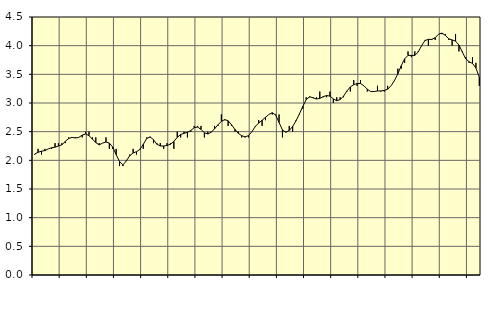
| Category | Piggar | Series 1 |
|---|---|---|
| nan | 2.1 | 2.11 |
| 87.0 | 2.2 | 2.14 |
| 87.0 | 2.1 | 2.16 |
| 87.0 | 2.2 | 2.17 |
| nan | 2.2 | 2.2 |
| 88.0 | 2.2 | 2.22 |
| 88.0 | 2.3 | 2.23 |
| 88.0 | 2.3 | 2.25 |
| nan | 2.3 | 2.27 |
| 89.0 | 2.3 | 2.33 |
| 89.0 | 2.4 | 2.38 |
| 89.0 | 2.4 | 2.4 |
| nan | 2.4 | 2.39 |
| 90.0 | 2.4 | 2.4 |
| 90.0 | 2.4 | 2.44 |
| 90.0 | 2.5 | 2.46 |
| nan | 2.5 | 2.43 |
| 91.0 | 2.4 | 2.37 |
| 91.0 | 2.4 | 2.31 |
| 91.0 | 2.3 | 2.27 |
| nan | 2.3 | 2.3 |
| 92.0 | 2.4 | 2.32 |
| 92.0 | 2.2 | 2.3 |
| 92.0 | 2.2 | 2.23 |
| nan | 2.2 | 2.1 |
| 93.0 | 1.9 | 1.98 |
| 93.0 | 1.9 | 1.92 |
| 93.0 | 2 | 1.99 |
| nan | 2.1 | 2.08 |
| 94.0 | 2.2 | 2.13 |
| 94.0 | 2.1 | 2.15 |
| 94.0 | 2.2 | 2.19 |
| nan | 2.2 | 2.28 |
| 95.0 | 2.4 | 2.38 |
| 95.0 | 2.4 | 2.41 |
| 95.0 | 2.3 | 2.36 |
| nan | 2.3 | 2.28 |
| 96.0 | 2.3 | 2.25 |
| 96.0 | 2.2 | 2.25 |
| 96.0 | 2.3 | 2.26 |
| nan | 2.3 | 2.28 |
| 97.0 | 2.2 | 2.33 |
| 97.0 | 2.5 | 2.4 |
| 97.0 | 2.4 | 2.45 |
| nan | 2.5 | 2.47 |
| 98.0 | 2.4 | 2.49 |
| 98.0 | 2.5 | 2.52 |
| 98.0 | 2.6 | 2.57 |
| nan | 2.6 | 2.58 |
| 99.0 | 2.6 | 2.54 |
| 99.0 | 2.4 | 2.48 |
| 99.0 | 2.5 | 2.46 |
| nan | 2.5 | 2.49 |
| 0.0 | 2.6 | 2.55 |
| 0.0 | 2.6 | 2.62 |
| 0.0 | 2.8 | 2.68 |
| nan | 2.7 | 2.71 |
| 1.0 | 2.6 | 2.69 |
| 1.0 | 2.6 | 2.62 |
| 1.0 | 2.5 | 2.54 |
| nan | 2.5 | 2.47 |
| 2.0 | 2.4 | 2.43 |
| 2.0 | 2.4 | 2.41 |
| 2.0 | 2.4 | 2.43 |
| nan | 2.5 | 2.5 |
| 3.0 | 2.6 | 2.59 |
| 3.0 | 2.7 | 2.65 |
| 3.0 | 2.6 | 2.7 |
| nan | 2.7 | 2.75 |
| 4.0 | 2.8 | 2.8 |
| 4.0 | 2.8 | 2.83 |
| 4.0 | 2.8 | 2.79 |
| nan | 2.8 | 2.66 |
| 5.0 | 2.4 | 2.53 |
| 5.0 | 2.5 | 2.49 |
| 5.0 | 2.6 | 2.52 |
| nan | 2.5 | 2.59 |
| 6.0 | 2.7 | 2.69 |
| 6.0 | 2.8 | 2.81 |
| 6.0 | 2.9 | 2.94 |
| nan | 3.1 | 3.06 |
| 7.0 | 3.1 | 3.11 |
| 7.0 | 3.1 | 3.09 |
| 7.0 | 3.1 | 3.07 |
| nan | 3.2 | 3.08 |
| 8.0 | 3.1 | 3.11 |
| 8.0 | 3.1 | 3.13 |
| 8.0 | 3.2 | 3.12 |
| nan | 3 | 3.07 |
| 9.0 | 3.1 | 3.04 |
| 9.0 | 3.1 | 3.06 |
| 9.0 | 3.1 | 3.12 |
| nan | 3.2 | 3.21 |
| 10.0 | 3.2 | 3.28 |
| 10.0 | 3.4 | 3.32 |
| 10.0 | 3.3 | 3.34 |
| nan | 3.4 | 3.34 |
| 11.0 | 3.3 | 3.3 |
| 11.0 | 3.2 | 3.24 |
| 11.0 | 3.2 | 3.2 |
| nan | 3.2 | 3.2 |
| 12.0 | 3.3 | 3.21 |
| 12.0 | 3.2 | 3.21 |
| 12.0 | 3.2 | 3.22 |
| nan | 3.3 | 3.24 |
| 13.0 | 3.3 | 3.3 |
| 13.0 | 3.4 | 3.39 |
| 13.0 | 3.6 | 3.51 |
| nan | 3.6 | 3.65 |
| 14.0 | 3.7 | 3.77 |
| 14.0 | 3.9 | 3.83 |
| 14.0 | 3.8 | 3.83 |
| nan | 3.9 | 3.83 |
| 15.0 | 3.9 | 3.89 |
| 15.0 | 4 | 4 |
| 15.0 | 4.1 | 4.09 |
| nan | 4 | 4.11 |
| 16.0 | 4.1 | 4.11 |
| 16.0 | 4.1 | 4.14 |
| 16.0 | 4.2 | 4.2 |
| nan | 4.2 | 4.22 |
| 17.0 | 4.2 | 4.18 |
| 17.0 | 4.1 | 4.12 |
| 17.0 | 4 | 4.1 |
| nan | 4.2 | 4.08 |
| 18.0 | 3.9 | 4.01 |
| 18.0 | 3.9 | 3.89 |
| 18.0 | 3.8 | 3.77 |
| nan | 3.7 | 3.72 |
| 19.0 | 3.8 | 3.69 |
| 19.0 | 3.7 | 3.61 |
| 19.0 | 3.3 | 3.45 |